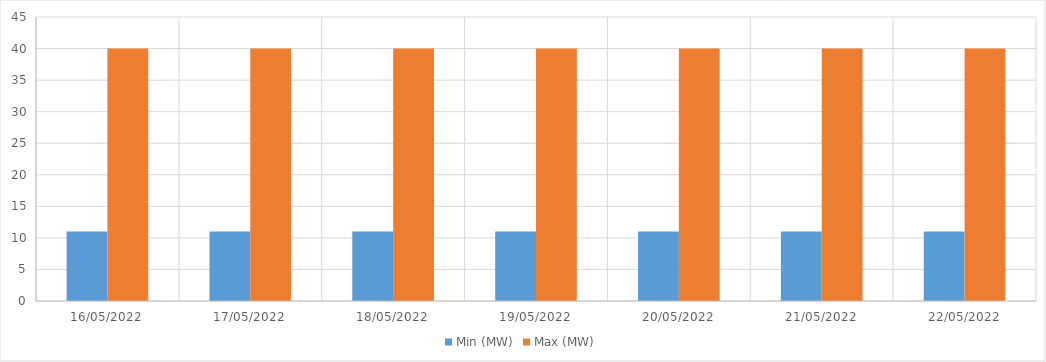
| Category | Min (MW) | Max (MW) |
|---|---|---|
| 16/05/2022 | 11 | 40 |
| 17/05/2022 | 11 | 40 |
| 18/05/2022 | 11 | 40 |
| 19/05/2022 | 11 | 40 |
| 20/05/2022 | 11 | 40 |
| 21/05/2022 | 11 | 40 |
| 22/05/2022 | 11 | 40 |